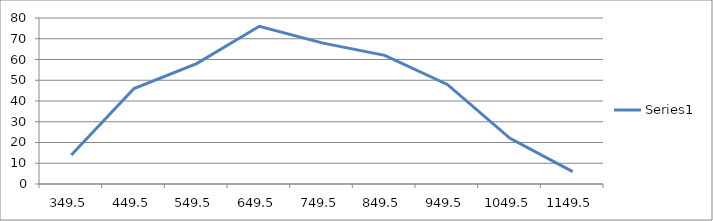
| Category | Series 0 |
|---|---|
| 349.5 | 14 |
| 449.5 | 46 |
| 549.5 | 58 |
| 649.5 | 76 |
| 749.5 | 68 |
| 849.5 | 62 |
| 949.5 | 48 |
| 1049.5 | 22 |
| 1149.5 | 6 |